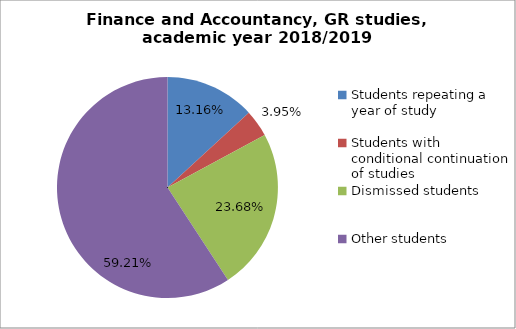
| Category | Series 0 |
|---|---|
| Students repeating a year of study | 20 |
| Students with conditional continuation of studies | 6 |
| Dismissed students | 36 |
| Other students | 90 |